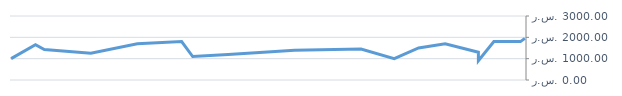
| Category | العائد |
|---|---|
| 2013-04-23 | 1950 |
| 2013-04-25 | 1800 |
| 2013-05-07 | 1800 |
| 2013-05-14 | 900 |
| 2013-05-14 | 1300 |
| 2013-05-29 | 1700 |
| 2013-06-10 | 1500 |
| 2013-06-21 | 1000 |
| 2013-07-06 | 1450 |
| 2013-08-05 | 1400 |
| 2013-08-19 | 1300 |
| 2013-09-04 | 1200 |
| 2013-09-20 | 1100 |
| 2013-09-25 | 1800 |
| 2013-10-15 | 1700 |
| 2013-11-05 | 1250 |
| 2013-11-26 | 1425 |
| 2013-11-30 | 1650 |
| 2013-12-11 | 1000 |